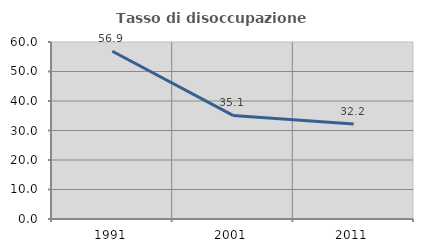
| Category | Tasso di disoccupazione giovanile  |
|---|---|
| 1991.0 | 56.876 |
| 2001.0 | 35.112 |
| 2011.0 | 32.209 |